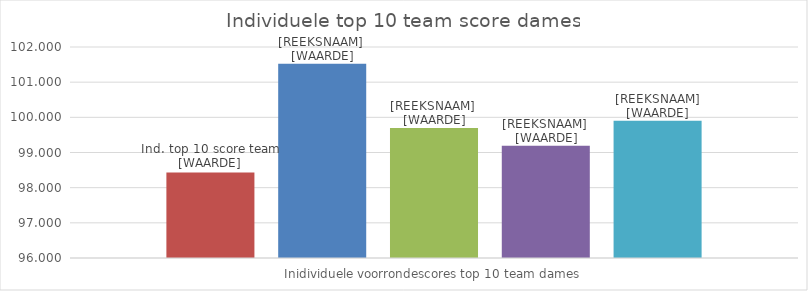
| Category | WK ind. Top 10 team score | Jackie | Niamh | Romana | Romee |
|---|---|---|---|---|---|
| Inidividuele voorrondescores top 10 team dames | 98.433 | 101.525 | 99.7 | 99.19 | 99.9 |